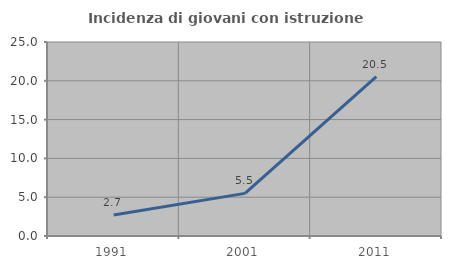
| Category | Incidenza di giovani con istruzione universitaria |
|---|---|
| 1991.0 | 2.703 |
| 2001.0 | 5.495 |
| 2011.0 | 20.548 |